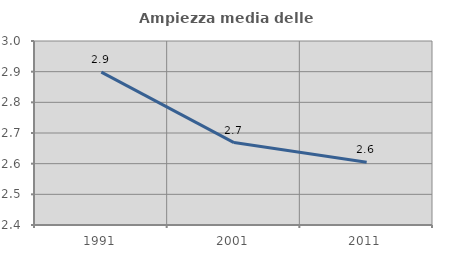
| Category | Ampiezza media delle famiglie |
|---|---|
| 1991.0 | 2.898 |
| 2001.0 | 2.669 |
| 2011.0 | 2.605 |